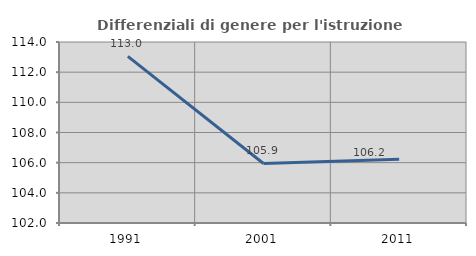
| Category | Differenziali di genere per l'istruzione superiore |
|---|---|
| 1991.0 | 113.047 |
| 2001.0 | 105.945 |
| 2011.0 | 106.222 |